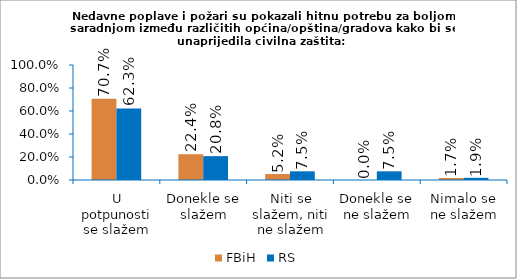
| Category | FBiH | RS |
|---|---|---|
| U potpunosti se slažem | 0.707 | 0.623 |
| Donekle se slažem | 0.224 | 0.208 |
| Niti se slažem, niti ne slažem | 0.052 | 0.075 |
| Donekle se ne slažem | 0 | 0.075 |
| Nimalo se ne slažem | 0.017 | 0.019 |